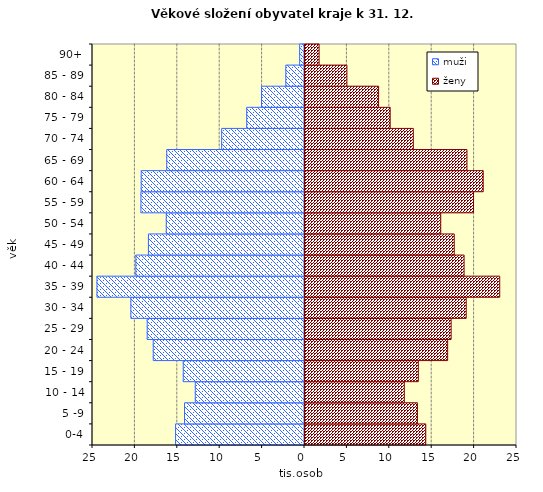
| Category | muži | ženy |
|---|---|---|
| 0-4 | -15201 | 14359 |
|  5 -9 | -14147 | 13377 |
|  10 - 14 | -12878 | 11827 |
| 15 - 19 | -14298 | 13481 |
| 20 - 24 | -17837 | 16940 |
| 25 - 29 | -18549 | 17351 |
| 30 - 34 | -20471 | 19128 |
| 35 - 39 | -24473 | 23081 |
| 40 - 44 | -19887 | 18878 |
| 45 - 49 | -18405 | 17717 |
| 50 - 54 | -16300 | 16126 |
| 55 - 59 | -19288 | 19987 |
| 60 - 64 | -19255 | 21134 |
| 65 - 69 | -16244 | 19217 |
| 70 - 74 | -9767 | 12888 |
| 75 - 79 | -6815 | 10162 |
| 80 - 84 | -5064 | 8797 |
| 85 - 89 | -2205 | 5059 |
| 90+ | -573 | 1780 |